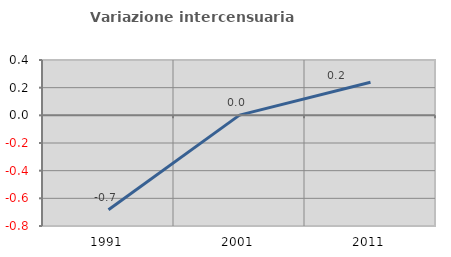
| Category | Variazione intercensuaria annua |
|---|---|
| 1991.0 | -0.683 |
| 2001.0 | 0.001 |
| 2011.0 | 0.239 |